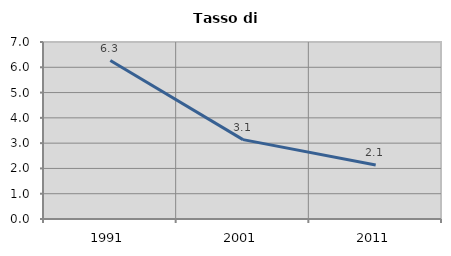
| Category | Tasso di disoccupazione   |
|---|---|
| 1991.0 | 6.266 |
| 2001.0 | 3.139 |
| 2011.0 | 2.139 |